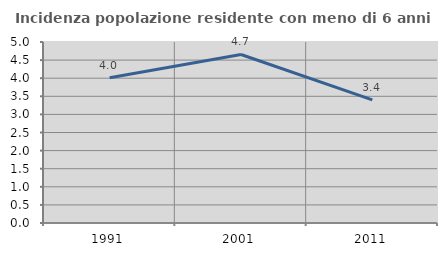
| Category | Incidenza popolazione residente con meno di 6 anni |
|---|---|
| 1991.0 | 4.015 |
| 2001.0 | 4.655 |
| 2011.0 | 3.401 |